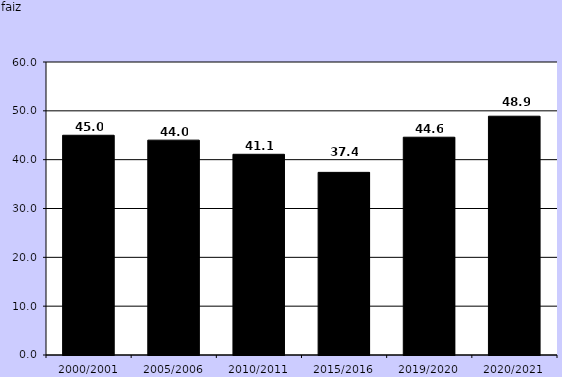
| Category | Series 1 |
|---|---|
| 2000/2001 | 45 |
| 2005/2006 | 44 |
| 2010/2011 | 41.1 |
| 2015/2016 | 37.4 |
| 2019/2020 | 44.6 |
| 2020/2021 | 48.9 |